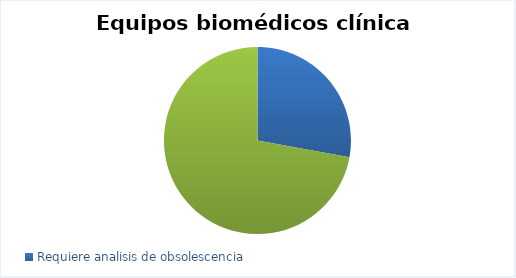
| Category | Total |
|---|---|
| Requiere analisis de obsolescencia | 546 |
| No requiere analisis de obsolescencia | 1413 |